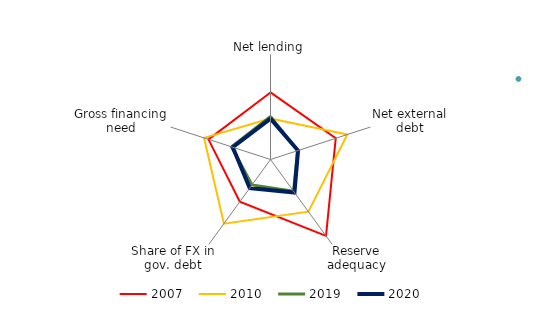
| Category | 2007 | 2008 | 2010 | 2019 | 2020 |
|---|---|---|---|---|---|
| Net lending | 0.832 |  | -0.661 | -0.541 | -0.663 |
| Net external debt | 0.919 |  | 1.616 | -1.371 | -1.344 |
| Reserve adequacy | 2.396 |  | 0.683 | -0.764 | -0.672 |
| Share of FX in gov. debt | -0.019 |  | 1.529 | -1.205 | -0.985 |
| Gross financing need | 0.727 |  | 0.993 | -0.657 | -0.732 |